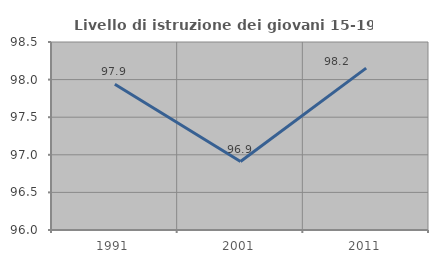
| Category | Livello di istruzione dei giovani 15-19 anni |
|---|---|
| 1991.0 | 97.939 |
| 2001.0 | 96.91 |
| 2011.0 | 98.152 |